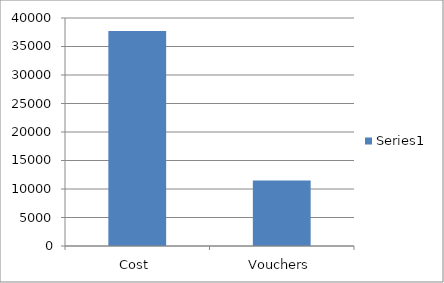
| Category | Series 0 |
|---|---|
| Cost  | 37715 |
| Vouchers | 11500 |